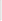
| Category | Series 1 |
|---|---|
| 0 | 706.4 |
| 1 | 2887 |
| 2 | 7878 |
| 3 | 3925.75 |
| 4 | 5361.65 |
| 5 | 8284.1 |
| 6 | 7838.85 |
| 7 | 6626.65 |
| 8 | 5664 |
| 9 | 9058.2 |
| 10 | 3478.05 |
| 11 | 3478.05 |